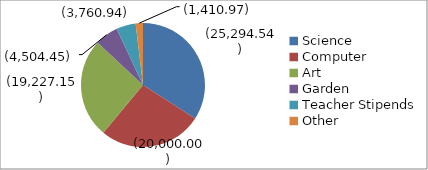
| Category | Series 0 |
|---|---|
| Science | -25294.54 |
| Computer | -20000 |
| Art | -19227.15 |
| Garden | -4504.45 |
| Teacher Stipends | -3760.94 |
| Other | -1410.965 |